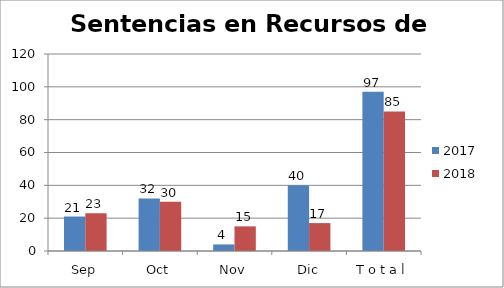
| Category | 2017 | 2018 |
|---|---|---|
| Sep | 21 | 23 |
| Oct | 32 | 30 |
| Nov | 4 | 15 |
| Dic | 40 | 17 |
| T o t a l | 97 | 85 |